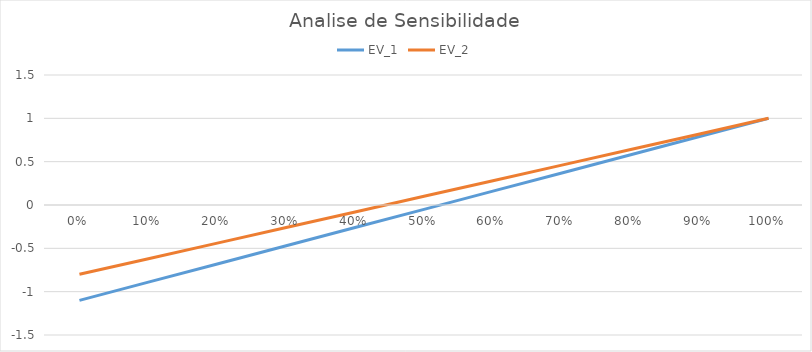
| Category | EV_1 | EV_2 |
|---|---|---|
| 0.0 | -1.1 | -0.8 |
| 0.1 | -0.89 | -0.62 |
| 0.2 | -0.68 | -0.44 |
| 0.3 | -0.47 | -0.26 |
| 0.4 | -0.26 | -0.08 |
| 0.5 | -0.05 | 0.1 |
| 0.6 | 0.16 | 0.28 |
| 0.7 | 0.37 | 0.46 |
| 0.8 | 0.58 | 0.64 |
| 0.9 | 0.79 | 0.82 |
| 1.0 | 1 | 1 |